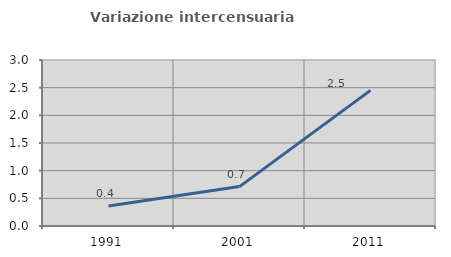
| Category | Variazione intercensuaria annua |
|---|---|
| 1991.0 | 0.362 |
| 2001.0 | 0.712 |
| 2011.0 | 2.451 |